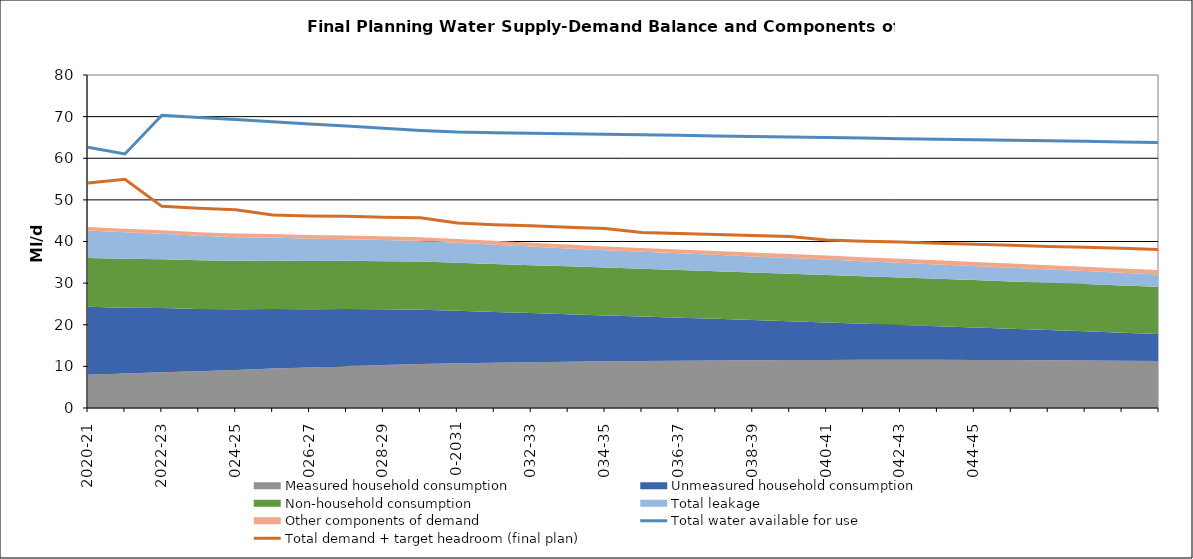
| Category | Total water available for use | Total demand + target headroom (final plan) |
|---|---|---|
| 2020-21 | 62.638 | 54.076 |
| 2021-22 | 61.028 | 54.962 |
| 2022-23 | 70.342 | 48.443 |
| 2023-24 | 69.818 | 48.017 |
| 2024-25 | 69.295 | 47.637 |
| 2025-26 | 68.771 | 46.349 |
| 2026-27 | 68.248 | 46.129 |
| 2027-28 | 67.724 | 46.092 |
| 2028-29 | 67.2 | 45.856 |
| 2029-30 | 66.677 | 45.699 |
| 2030-31 | 66.284 | 44.436 |
| 2031-32 | 66.153 | 44.048 |
| 2032-33 | 66.022 | 43.774 |
| 2033-34 | 65.891 | 43.433 |
| 2034-35 | 65.76 | 43.129 |
| 2035-36 | 65.629 | 42.168 |
| 2036-37 | 65.498 | 41.93 |
| 2037-38 | 65.368 | 41.686 |
| 2038-39 | 65.237 | 41.418 |
| 2039-40 | 65.106 | 41.197 |
| 2040-41 | 64.975 | 40.362 |
| 2041-42 | 64.844 | 40.074 |
| 2042-43 | 64.713 | 39.86 |
| 2043-44 | 64.582 | 39.58 |
| 2044-45 | 64.451 | 39.336 |
| 2045-46 | 64.32 | 39.082 |
| 2046-47 | 64.189 | 38.828 |
| 2047-48 | 64.058 | 38.612 |
| 2048-49 | 63.927 | 38.36 |
| 2049-50 | 63.797 | 38.091 |